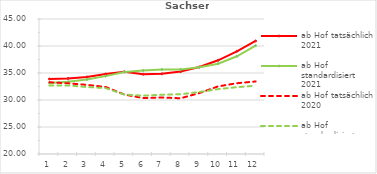
| Category | ab Hof tatsächlich 2021 | ab Hof standardisiert 2021 | ab Hof tatsächlich 2020 | ab Hof standardisiert 2020 |
|---|---|---|---|---|
| 0 | 33.893 | 33.143 | 33.286 | 32.698 |
| 1 | 33.99 | 33.381 | 33.088 | 32.69 |
| 2 | 34.275 | 33.804 | 32.805 | 32.407 |
| 3 | 34.806 | 34.421 | 32.412 | 32.199 |
| 4 | 35.221 | 35.196 | 31.013 | 31.008 |
| 5 | 34.776 | 35.48 | 30.362 | 30.801 |
| 6 | 34.847 | 35.636 | 30.46 | 30.985 |
| 7 | 35.263 | 35.665 | 30.319 | 31.059 |
| 8 | 36.103 | 36.069 | 31.284 | 31.486 |
| 9 | 37.353 | 36.727 | 32.523 | 32.008 |
| 10 | 39.022 | 38.099 | 33.106 | 32.382 |
| 11 | 40.928 | 40.077 | 33.433 | 32.64 |